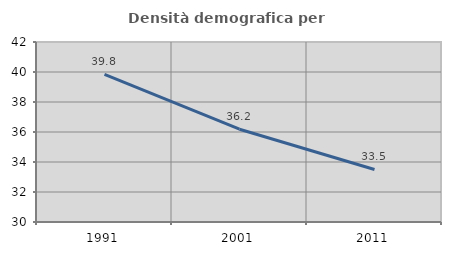
| Category | Densità demografica |
|---|---|
| 1991.0 | 39.844 |
| 2001.0 | 36.185 |
| 2011.0 | 33.503 |